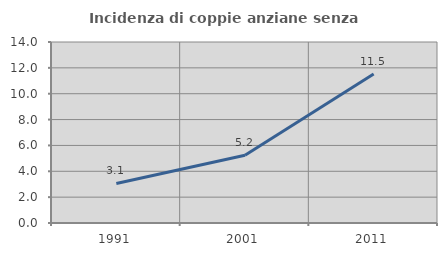
| Category | Incidenza di coppie anziane senza figli  |
|---|---|
| 1991.0 | 3.061 |
| 2001.0 | 5.244 |
| 2011.0 | 11.524 |